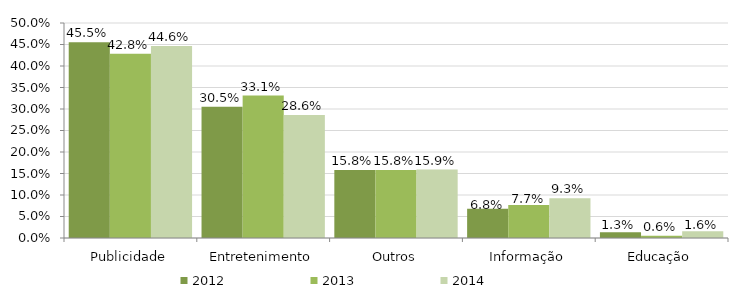
| Category | 2012 | 2013 | 2014 |
|---|---|---|---|
| Publicidade | 0.455 | 0.428 | 0.446 |
| Entretenimento | 0.305 | 0.331 | 0.286 |
| Outros | 0.158 | 0.158 | 0.159 |
| Informação | 0.068 | 0.077 | 0.093 |
| Educação | 0.013 | 0.006 | 0.016 |